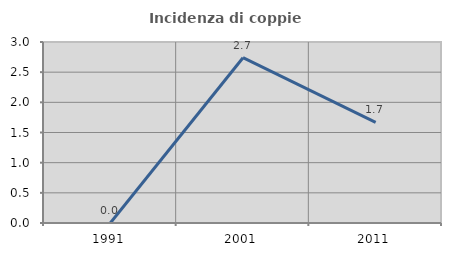
| Category | Incidenza di coppie miste |
|---|---|
| 1991.0 | 0 |
| 2001.0 | 2.74 |
| 2011.0 | 1.667 |